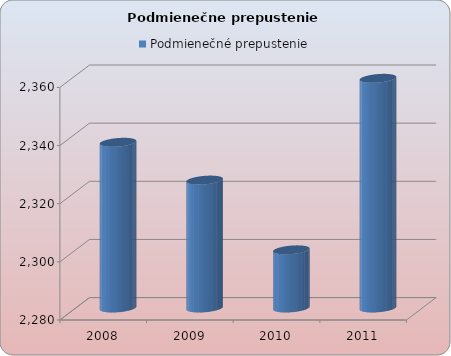
| Category | Podmienečné prepustenie |
|---|---|
| 2008.0 | 2337 |
| 2009.0 | 2324 |
| 2010.0 | 2300 |
| 2011.0 | 2359 |